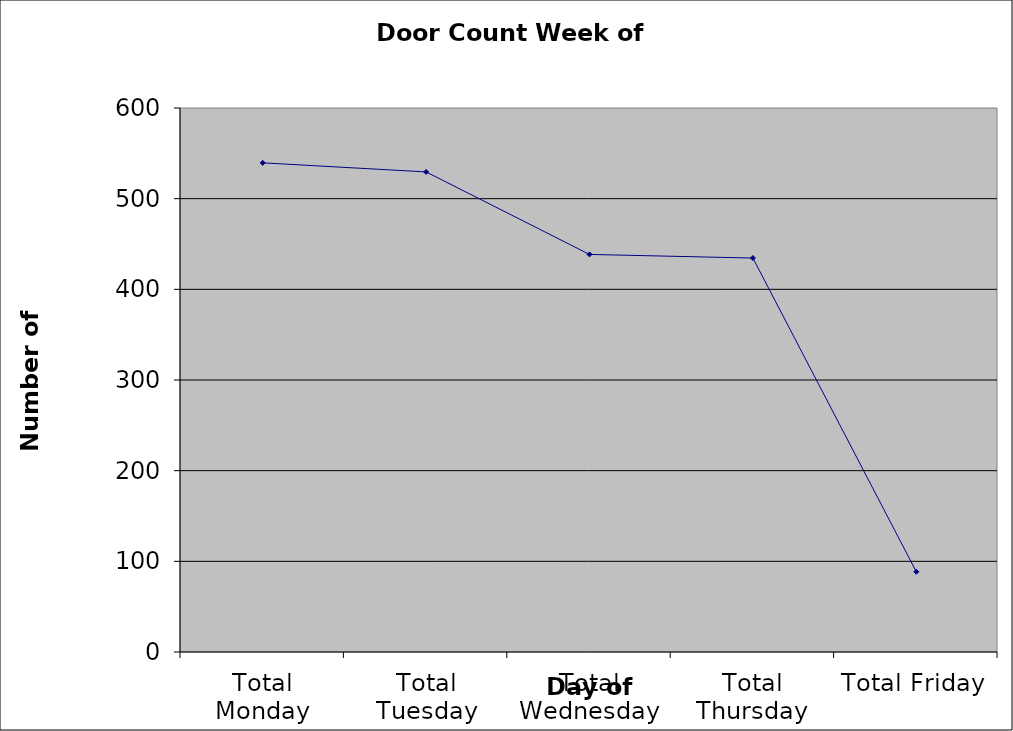
| Category | Series 0 |
|---|---|
| Total Monday | 539.5 |
| Total Tuesday | 529.5 |
| Total Wednesday | 438.5 |
| Total Thursday | 434.5 |
| Total Friday | 88.5 |